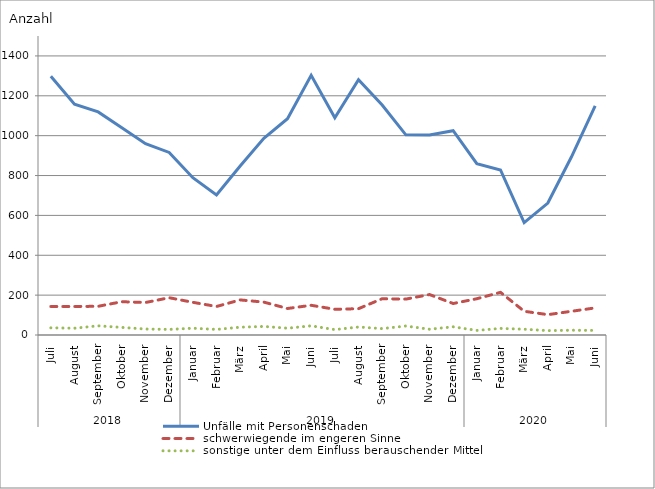
| Category | Unfälle mit Personenschaden | schwerwiegende im engeren Sinne | sonstige unter dem Einfluss berauschender Mittel |
|---|---|---|---|
| 0 | 1298 | 143 | 36 |
| 1 | 1158 | 143 | 34 |
| 2 | 1119 | 144 | 46 |
| 3 | 1040 | 167 | 38 |
| 4 | 960 | 163 | 30 |
| 5 | 916 | 187 | 28 |
| 6 | 789 | 164 | 34 |
| 7 | 702 | 143 | 28 |
| 8 | 848 | 176 | 39 |
| 9 | 987 | 165 | 43 |
| 10 | 1085 | 133 | 34 |
| 11 | 1303 | 149 | 46 |
| 12 | 1090 | 129 | 27 |
| 13 | 1281 | 132 | 40 |
| 14 | 1154 | 182 | 32 |
| 15 | 1004 | 180 | 45 |
| 16 | 1003 | 203 | 29 |
| 17 | 1025 | 158 | 41 |
| 18 | 860 | 182 | 23 |
| 19 | 828 | 214 | 33 |
| 20 | 564 | 119 | 29 |
| 21 | 662 | 102 | 22 |
| 22 | 894 | 119 | 24 |
| 23 | 1150 | 136 | 23 |